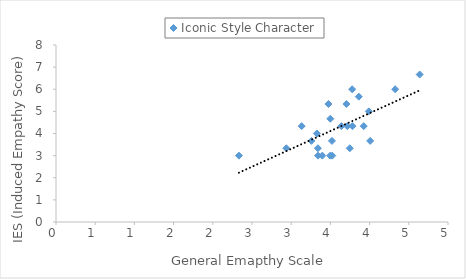
| Category | Iconic Style Character |
|---|---|
| 3.6402777777777775 | 4.333 |
| 3.340277777777778 | 3.333 |
| 3.704166666666666 | 5.333 |
| 3.777777777777778 | 6 |
| 3.7152777777777772 | 4.333 |
| 4.326388888888888 | 6 |
| 3.475 | 5.333 |
| 3.327777777777778 | 4 |
| 3.8624999999999994 | 5.667 |
| 4.638888888888888 | 6.667 |
| 3.9250000000000003 | 4.333 |
| 3.990277777777777 | 5 |
| 3.5236111111111117 | 3 |
| 3.7805555555555554 | 4.333 |
| 3.1333333333333333 | 4.333 |
| 2.9375 | 3.333 |
| 2.3333333333333335 | 3 |
| 3.2583333333333333 | 3.667 |
| 3.7472222222222222 | 3.333 |
| 3.397222222222222 | 3 |
| 3.5194444444444444 | 3.667 |
| 3.497222222222222 | 3 |
| 3.4986111111111113 | 4.667 |
| 3.341666666666667 | 3 |
| 4.006944444444445 | 3.667 |